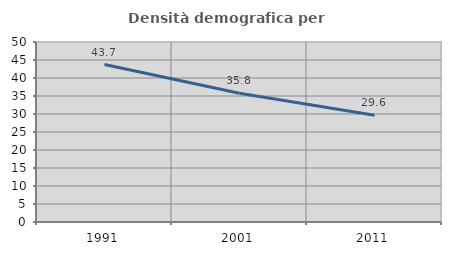
| Category | Densità demografica |
|---|---|
| 1991.0 | 43.749 |
| 2001.0 | 35.785 |
| 2011.0 | 29.629 |